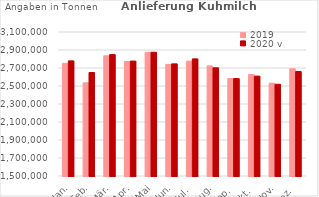
| Category | 2019 | 2020 v |
|---|---|---|
| Jan. | 2751690.319 | 2779008.195 |
| Feb. | 2535218.586 | 2649736.292 |
| Mär. | 2835643.778 | 2848836.123 |
| Apr. | 2772642.525 | 2777074.277 |
| Mai | 2874223.58 | 2875092.325 |
| Jun. | 2739985.123 | 2745853.779 |
| Jul. | 2776629.561 | 2801361.979 |
| Aug. | 2723374.265 | 2702127.312 |
| Sep. | 2583170.333 | 2582327.45 |
| Okt. | 2627632.241 | 2609998.306 |
| Nov. | 2531215.698 | 2519408.917 |
| Dez. | 2690785.319 | 2661295.401 |